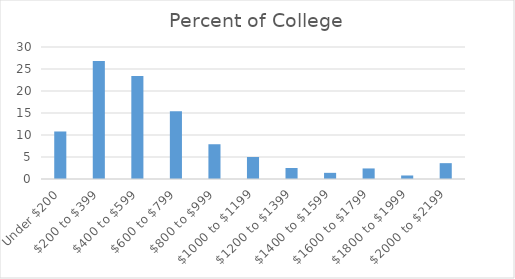
| Category | Percent of College |
|---|---|
| Under $200 | 10.8 |
| $200 to $399 | 26.8 |
| $400 to $599 | 23.4 |
| $600 to $799 | 15.4 |
| $800 to $999 | 7.9 |
| $1000 to $1199 | 5 |
| $1200 to $1399 | 2.5 |
| $1400 to $1599 | 1.4 |
| $1600 to $1799 | 2.4 |
| $1800 to $1999 | 0.8 |
| $2000 to $2199 | 3.6 |